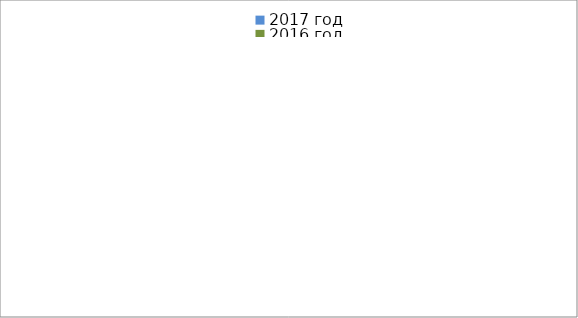
| Category | 2017 год | 2016 год |
|---|---|---|
|  - поджог | 12 | 29 |
|  - неосторожное обращение с огнём | 4 | 20 |
|  - НПТЭ электрооборудования | 12 | 12 |
|  - НПУ и Э печей | 30 | 28 |
|  - НПУ и Э транспортных средств | 40 | 19 |
|   -Шалость с огнем детей | 3 | 5 |
|  -НППБ при эксплуатации эл.приборов | 20 | 7 |
|  - курение | 25 | 12 |
| - прочие | 59 | 64 |
| - не установленные причины | 0 | 11 |